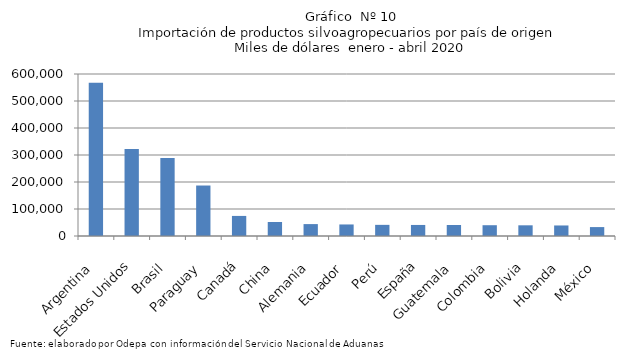
| Category | Series 0 |
|---|---|
| Argentina | 567863.718 |
| Estados Unidos | 322120.781 |
| Brasil | 288673.49 |
| Paraguay | 186957.864 |
| Canadá | 74362.34 |
| China | 51912.032 |
| Alemania | 44084.679 |
| Ecuador | 42755.358 |
| Perú | 41277.19 |
| España | 40904.214 |
| Guatemala | 40716.03 |
| Colombia | 39951.312 |
| Bolivia | 39596.005 |
| Holanda | 39026.503 |
| México | 33019.758 |